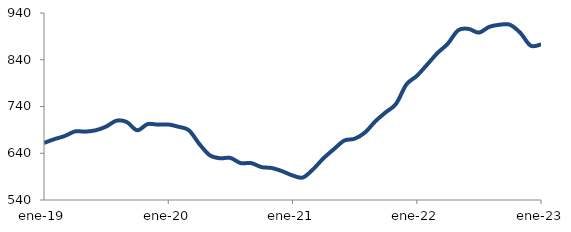
| Category | Series 0 |
|---|---|
| 2019-01-01 | 662.041 |
| 2019-02-01 | 670.134 |
| 2019-03-01 | 676.827 |
| 2019-04-01 | 686.669 |
| 2019-05-01 | 686.255 |
| 2019-06-01 | 689.181 |
| 2019-07-01 | 697.076 |
| 2019-08-01 | 709.635 |
| 2019-09-01 | 706.734 |
| 2019-10-01 | 689.137 |
| 2019-11-01 | 702.277 |
| 2019-12-01 | 701.214 |
| 2020-01-01 | 701.517 |
| 2020-02-01 | 696.552 |
| 2020-03-01 | 689.099 |
| 2020-04-01 | 659.896 |
| 2020-05-01 | 635.894 |
| 2020-06-01 | 629.29 |
| 2020-07-01 | 629.994 |
| 2020-08-01 | 618.866 |
| 2020-09-01 | 619.022 |
| 2020-10-01 | 610.428 |
| 2020-11-01 | 608.402 |
| 2020-12-01 | 601.605 |
| 2021-01-01 | 592.504 |
| 2021-02-01 | 588.185 |
| 2021-03-01 | 605.989 |
| 2021-04-01 | 629.446 |
| 2021-05-01 | 648.73 |
| 2021-06-01 | 667.177 |
| 2021-07-01 | 670.996 |
| 2021-08-01 | 684.389 |
| 2021-09-01 | 708.308 |
| 2021-10-01 | 727.608 |
| 2021-11-01 | 745.65 |
| 2021-12-01 | 787.184 |
| 2022-01-01 | 805.308 |
| 2022-02-01 | 829.502 |
| 2022-03-01 | 854.336 |
| 2022-04-01 | 874.453 |
| 2022-05-01 | 903.049 |
| 2022-06-01 | 906.022 |
| 2022-07-01 | 898.071 |
| 2022-08-01 | 910.353 |
| 2022-09-01 | 914.859 |
| 2022-10-01 | 914.857 |
| 2022-11-01 | 897.607 |
| 2022-12-01 | 870.196 |
| 2023-01-01 | 872.784 |